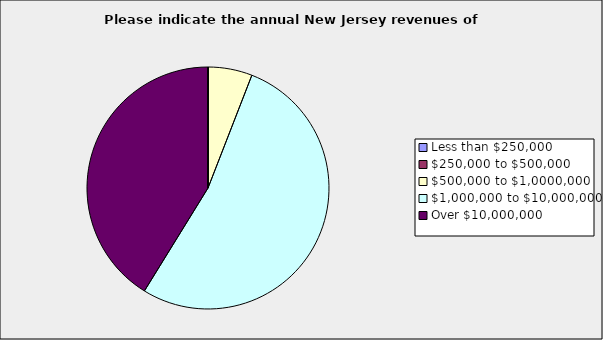
| Category | Series 0 |
|---|---|
| Less than $250,000 | 0 |
| $250,000 to $500,000 | 0 |
| $500,000 to $1,0000,000 | 0.059 |
| $1,000,000 to $10,000,000 | 0.529 |
| Over $10,000,000 | 0.412 |